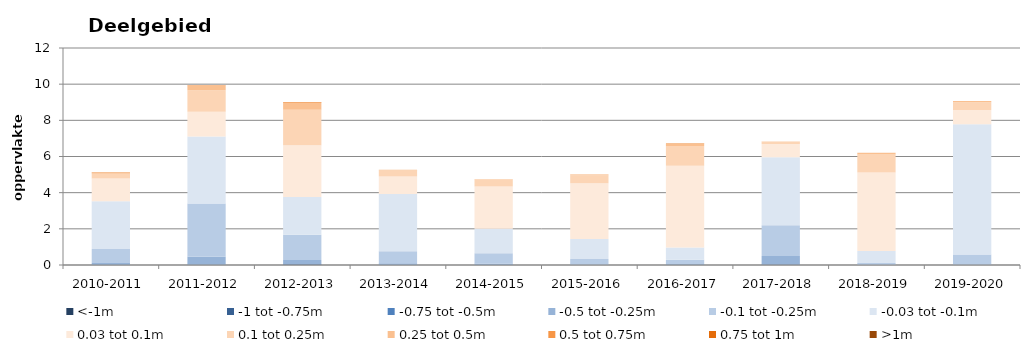
| Category | <-1m | -1 tot -0.75m | -0.75 tot -0.5m | -0.5 tot -0.25m | -0.1 tot -0.25m | -0.03 tot -0.1m | 0.03 tot 0.1m | 0.1 tot 0.25m | 0.25 tot 0.5m | 0.5 tot 0.75m | 0.75 tot 1m | >1m |
|---|---|---|---|---|---|---|---|---|---|---|---|---|
| 2010-2011 | 0 | 0 | 0.006 | 0.104 | 0.775 | 2.645 | 1.259 | 0.26 | 0.061 | 0.011 | 0.003 | 0.001 |
| 2011-2012 | 0 | 0.001 | 0.018 | 0.44 | 2.946 | 3.703 | 1.372 | 1.189 | 0.27 | 0.014 | 0.002 | 0 |
| 2012-2013 | 0.009 | 0.008 | 0.029 | 0.236 | 1.386 | 2.095 | 2.856 | 1.972 | 0.38 | 0.034 | 0.006 | 0.002 |
| 2013-2014 | 0 | 0 | 0.004 | 0.087 | 0.664 | 3.168 | 0.972 | 0.337 | 0.034 | 0.002 | 0.001 | 0 |
| 2014-2015 | 0 | 0.001 | 0.003 | 0.074 | 0.573 | 1.351 | 2.342 | 0.364 | 0.033 | 0.004 | 0 | 0 |
| 2015-2016 | 0.001 | 0 | 0.001 | 0.027 | 0.309 | 1.096 | 3.081 | 0.447 | 0.035 | 0.001 | 0 | 0 |
| 2016-2017 | 0 | 0 | 0.008 | 0.048 | 0.232 | 0.686 | 4.51 | 1.1 | 0.14 | 0.002 | 0.001 | 0 |
| 2017-2018 | 0 | 0.001 | 0.028 | 0.474 | 1.697 | 3.755 | 0.744 | 0.119 | 0.017 | 0 | 0 | 0 |
| 2018-2019 | 0 | 0 | 0 | 0.006 | 0.098 | 0.671 | 4.335 | 1 | 0.095 | 0.003 | 0.001 | 0 |
| 2019-2020 | 0 | 0 | 0.001 | 0.031 | 0.55 | 7.199 | 0.787 | 0.436 | 0.064 | 0.004 | 0.001 | 0 |